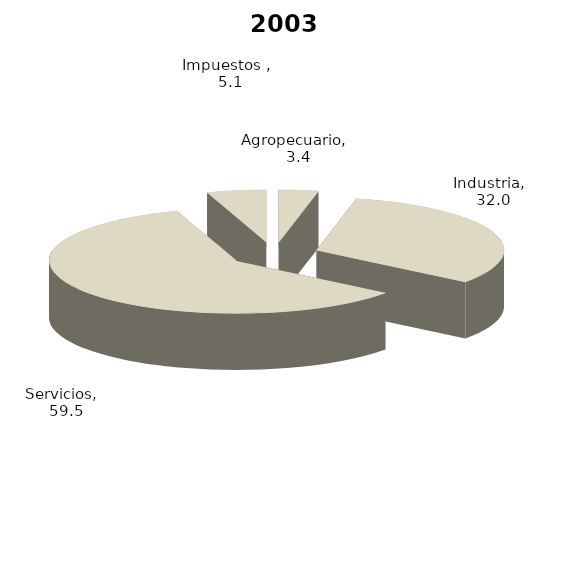
| Category | 2003 |
|---|---|
| Agropecuario | 3.403 |
| Industria | 31.99 |
| Servicios | 59.498 |
| Impuestos  | 5.11 |